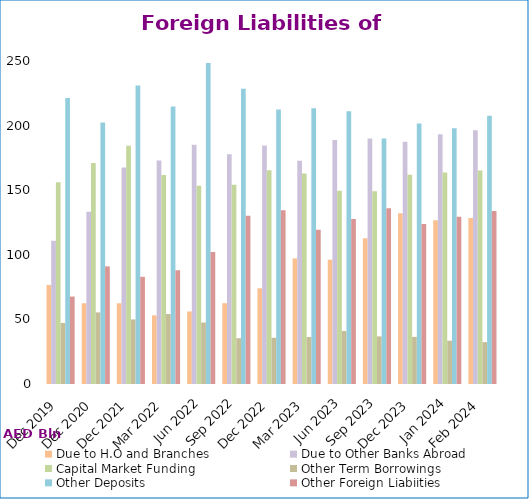
| Category | Due to H.O and Branches | Due to Other Banks Abroad | Capital Market Funding | Other Term Borrowings | Other Deposits | Other Foreign Liabiities |
|---|---|---|---|---|---|---|
| Dec 2019 | 76669 | 110837 | 156158 | 47269 | 221372 | 67674 |
| Dec 2020 | 62459 | 133262 | 170991 | 55403 | 202443 | 91048 |
| Dec 2021 | 62486 | 167631 | 184395 | 49986 | 230994 | 82969 |
| Mar 2022 | 53140 | 172976 | 161854 | 54168 | 214802 | 88051 |
| Jun 2022 | 56138 | 185125 | 153505 | 47560 | 248384 | 102144 |
| Sep 2022 | 62536 | 177735 | 154154 | 35422 | 228614 | 130247 |
| Dec 2022 | 74066 | 184619 | 165356 | 35799 | 212530 | 134573 |
| Mar 2023 | 97256 | 172704 | 162883 | 36413 | 213355 | 119382 |
| Jun 2023 | 96179 | 188882 | 149482 | 41039 | 211148 | 127659 |
| Sep 2023 | 112816 | 189946 | 149210 | 36838 | 190100 | 136029 |
| Dec 2023 | 132129 | 187511 | 161995 | 36457 | 201533 | 123878 |
| Jan 2024 | 126666 | 193220 | 163714 | 33488 | 197898 | 129389 |
| Feb 2024 | 128455 | 196311 | 165326 | 32400 | 207669 | 133868 |